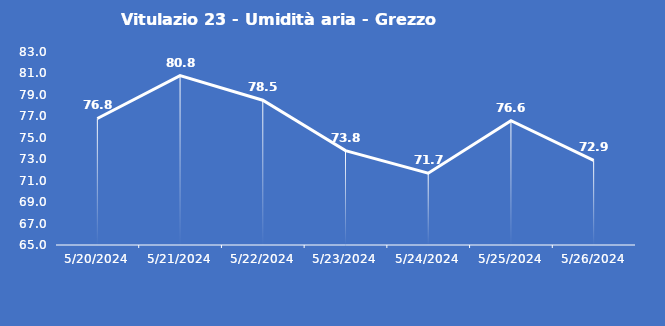
| Category | Vitulazio 23 - Umidità aria - Grezzo (%) |
|---|---|
| 5/20/24 | 76.8 |
| 5/21/24 | 80.8 |
| 5/22/24 | 78.5 |
| 5/23/24 | 73.8 |
| 5/24/24 | 71.7 |
| 5/25/24 | 76.6 |
| 5/26/24 | 72.9 |